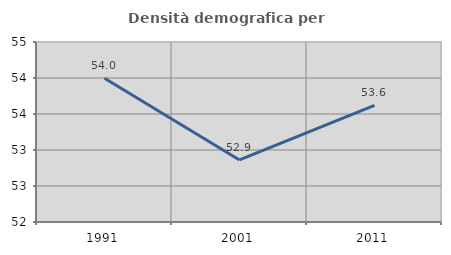
| Category | Densità demografica |
|---|---|
| 1991.0 | 53.997 |
| 2001.0 | 52.862 |
| 2011.0 | 53.619 |